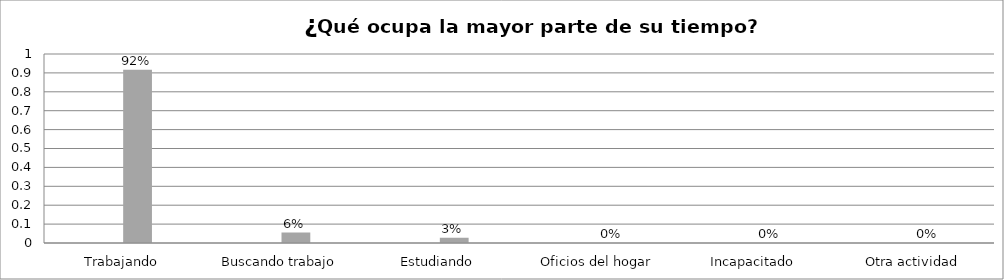
| Category | Series 0 | Series 1 | Series 2 | Series 3 |
|---|---|---|---|---|
| Trabajando |  |  | 0.917 |  |
| Buscando trabajo |  |  | 0.056 |  |
| Estudiando |  |  | 0.028 |  |
| Oficios del hogar |  |  | 0 |  |
| Incapacitado  |  |  | 0 |  |
| Otra actividad |  |  | 0 |  |